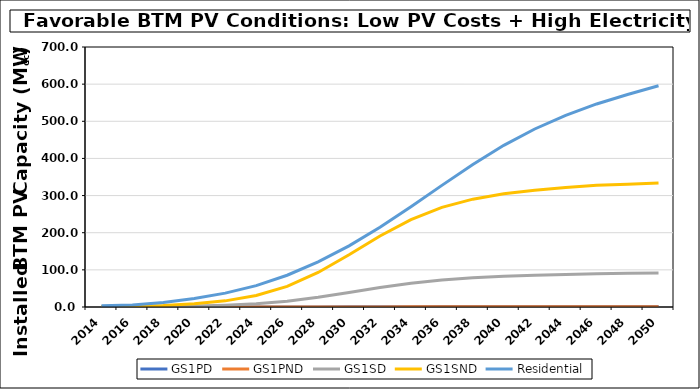
| Category | GS1PD | GS1PND | GS1SD | GS1SND | Residential |
|---|---|---|---|---|---|
| 2014.0 | 0 | 0 | 0.382 | 1.269 | 3.168 |
| 2016.0 | 0 | 0 | 0.616 | 2.078 | 5.467 |
| 2018.0 | 0.007 | 0.003 | 1.254 | 4.292 | 12.195 |
| 2020.0 | 0.021 | 0.008 | 2.468 | 8.544 | 22.717 |
| 2022.0 | 0.046 | 0.019 | 4.721 | 16.531 | 37.346 |
| 2024.0 | 0.092 | 0.038 | 8.768 | 30.99 | 57.588 |
| 2026.0 | 0.174 | 0.071 | 15.628 | 55.574 | 85.513 |
| 2028.0 | 0.307 | 0.125 | 26.008 | 92.952 | 121.572 |
| 2030.0 | 0.491 | 0.201 | 38.789 | 140.572 | 164.622 |
| 2032.0 | 0.71 | 0.292 | 52.234 | 191.122 | 214.867 |
| 2034.0 | 0.923 | 0.38 | 63.978 | 235.248 | 270.238 |
| 2036.0 | 1.097 | 0.452 | 72.764 | 268.137 | 327.486 |
| 2038.0 | 1.22 | 0.503 | 78.789 | 290.372 | 383.569 |
| 2040.0 | 1.302 | 0.537 | 82.769 | 304.81 | 435.316 |
| 2042.0 | 1.358 | 0.559 | 85.542 | 314.572 | 479.241 |
| 2044.0 | 1.4 | 0.576 | 87.806 | 322.045 | 516.062 |
| 2046.0 | 1.429 | 0.588 | 89.573 | 327.537 | 546.668 |
| 2048.0 | 1.446 | 0.595 | 90.583 | 330.704 | 572.173 |
| 2050.0 | 1.462 | 0.602 | 91.728 | 334.129 | 595.548 |